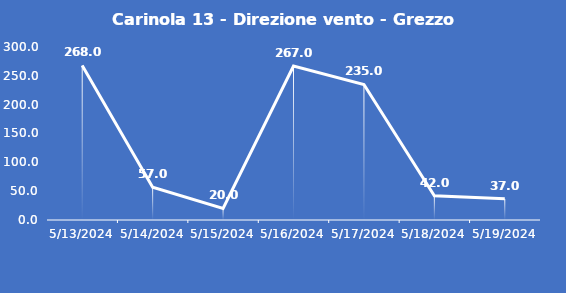
| Category | Carinola 13 - Direzione vento - Grezzo (°N) |
|---|---|
| 5/13/24 | 268 |
| 5/14/24 | 57 |
| 5/15/24 | 20 |
| 5/16/24 | 267 |
| 5/17/24 | 235 |
| 5/18/24 | 42 |
| 5/19/24 | 37 |